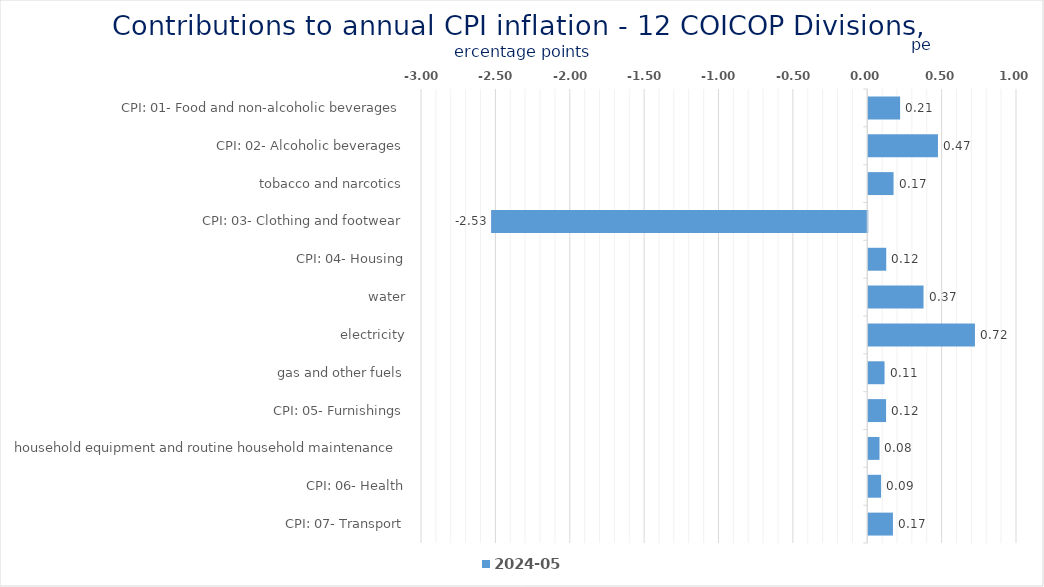
| Category | 2024-05 |
|---|---|
| CPI: 01- Food and non-alcoholic beverages | 0.214 |
| CPI: 02- Alcoholic beverages, tobacco and narcotics | 0.469 |
| CPI: 03- Clothing and footwear | 0.17 |
| CPI: 04- Housing, water, electricity, gas and other fuels | -2.529 |
| CPI: 05- Furnishings, household equipment and routine household maintenance | 0.121 |
| CPI: 06- Health | 0.372 |
| CPI: 07- Transport | 0.717 |
| CPI: 08- Communication | 0.109 |
| CPI: 09- Recreation and culture | 0.12 |
| CPI: 10- Education | 0.076 |
| CPI: 11- Restaurants and hotels | 0.086 |
| CPI: 12- Miscellaneous goods and services | 0.166 |